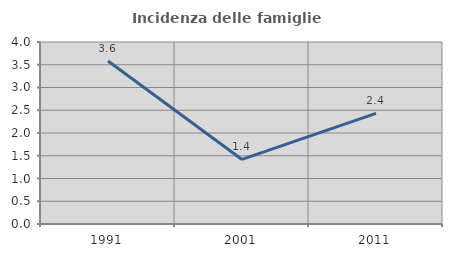
| Category | Incidenza delle famiglie numerose |
|---|---|
| 1991.0 | 3.584 |
| 2001.0 | 1.419 |
| 2011.0 | 2.43 |